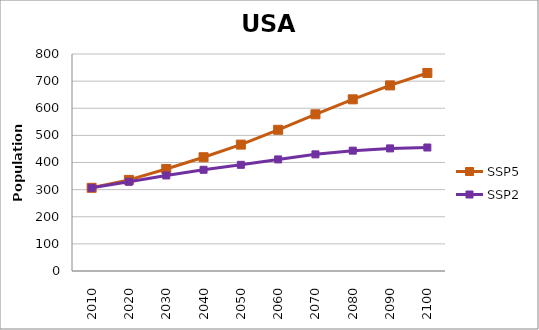
| Category | SSP5 | SSP2 |
|---|---|---|
| 2010.0 | 306675006 | 306675006 |
| 2020.0 | 335849443 | 328848543 |
| 2030.0 | 376171724 | 352256975 |
| 2040.0 | 419378700 | 373150809 |
| 2050.0 | 465996322 | 391430576 |
| 2060.0 | 520566720 | 411314198 |
| 2070.0 | 577693697 | 430004407 |
| 2080.0 | 632905164 | 443720836 |
| 2090.0 | 684255443 | 452015681 |
| 2100.0 | 730080770 | 455266039 |